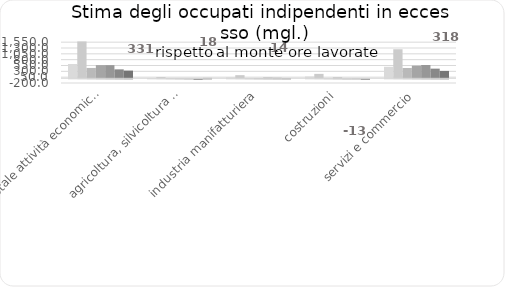
| Category | T1-2020 | T2-2020 | T3-2020 | T4-2020 | T1-2021 | T2-2021 | T3-2021 |
|---|---|---|---|---|---|---|---|
| totale attività economiche | 615.138 | 1580.558 | 445.126 | 566.781 | 565.046 | 384.63 | 331.483 |
| agricoltura, silvicoltura e pesca | 17.037 | 55.737 | 10.199 | 5.881 | -2.204 | -20.132 | 17.559 |
| industria manifatturiera | 46.859 | 135.863 | 8.639 | 14.409 | 28.22 | 21.364 | 13.906 |
| costruzioni | 79.425 | 191.376 | -0.396 | 31.291 | -1.771 | 3.045 | -12.978 |
| servizi e commercio | 495.117 | 1246.06 | 443.454 | 542.26 | 572.176 | 415.429 | 318.402 |